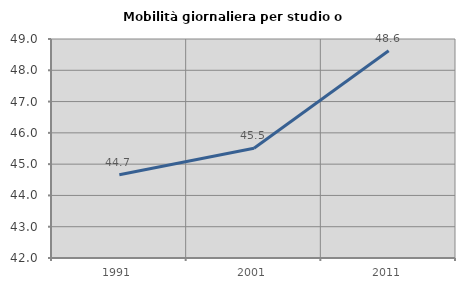
| Category | Mobilità giornaliera per studio o lavoro |
|---|---|
| 1991.0 | 44.661 |
| 2001.0 | 45.507 |
| 2011.0 | 48.626 |